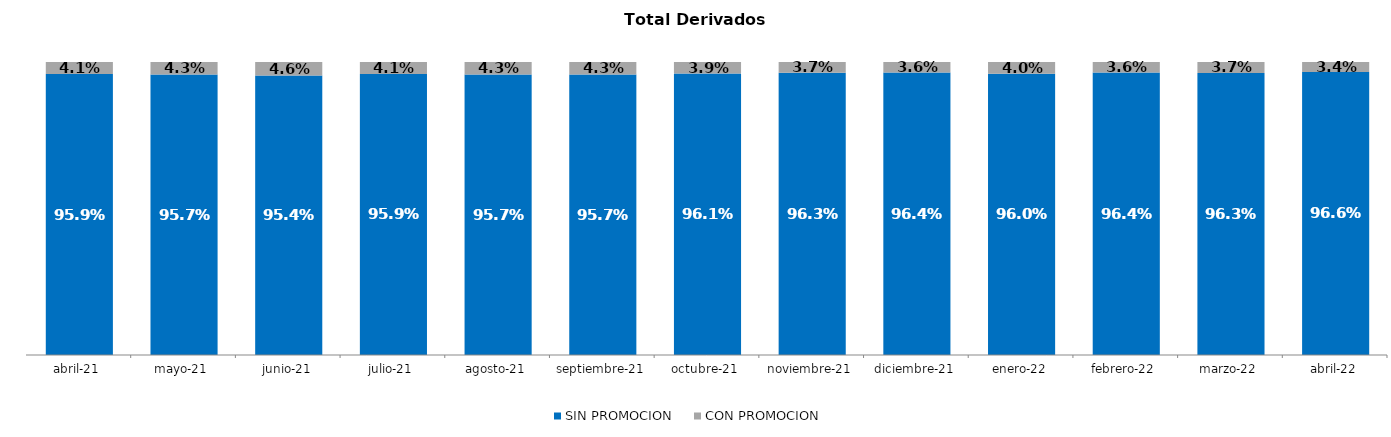
| Category | SIN PROMOCION   | CON PROMOCION   |
|---|---|---|
| 2021-04-01 | 0.959 | 0.041 |
| 2021-05-01 | 0.957 | 0.043 |
| 2021-06-01 | 0.954 | 0.046 |
| 2021-07-01 | 0.959 | 0.041 |
| 2021-08-01 | 0.957 | 0.043 |
| 2021-09-01 | 0.957 | 0.043 |
| 2021-10-01 | 0.961 | 0.039 |
| 2021-11-01 | 0.963 | 0.037 |
| 2021-12-01 | 0.964 | 0.036 |
| 2022-01-01 | 0.96 | 0.04 |
| 2022-02-01 | 0.964 | 0.036 |
| 2022-03-01 | 0.963 | 0.037 |
| 2022-04-01 | 0.966 | 0.034 |